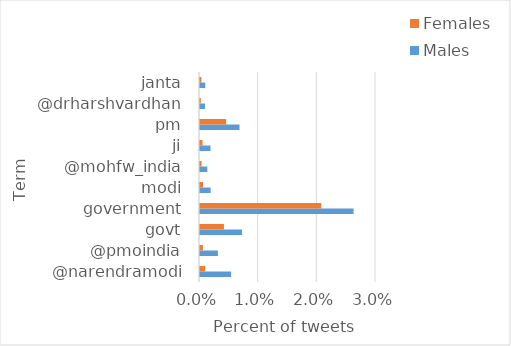
| Category | Males | Females |
|---|---|---|
| @narendramodi | 0.005 | 0.001 |
| @pmoindia | 0.003 | 0 |
| govt | 0.007 | 0.004 |
| government | 0.026 | 0.021 |
| modi | 0.002 | 0.001 |
| @mohfw_india | 0.001 | 0 |
| ji | 0.002 | 0 |
| pm | 0.007 | 0.004 |
| @drharshvardhan | 0.001 | 0 |
| janta | 0.001 | 0 |